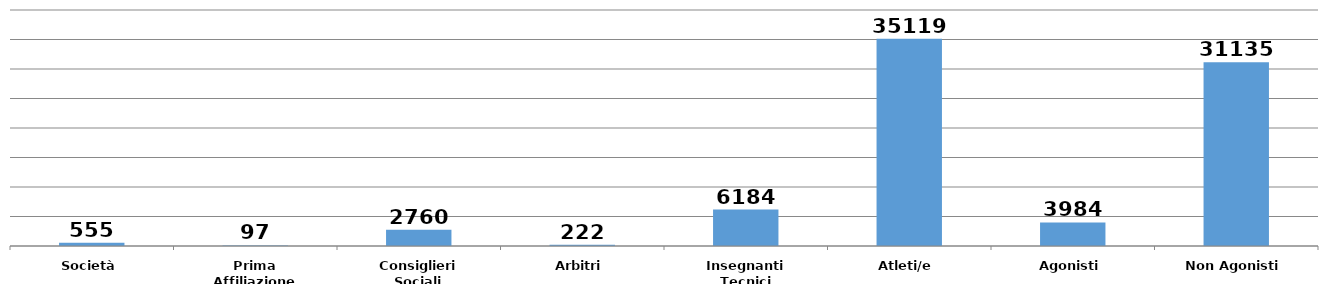
| Category | Series 0 |
|---|---|
| Società | 555 |
| Prima Affiliazione | 97 |
| Consiglieri Sociali | 2760 |
| Arbitri | 222 |
| Insegnanti Tecnici | 6184 |
| Atleti/e | 35119 |
| Agonisti | 3984 |
| Non Agonisti | 31135 |